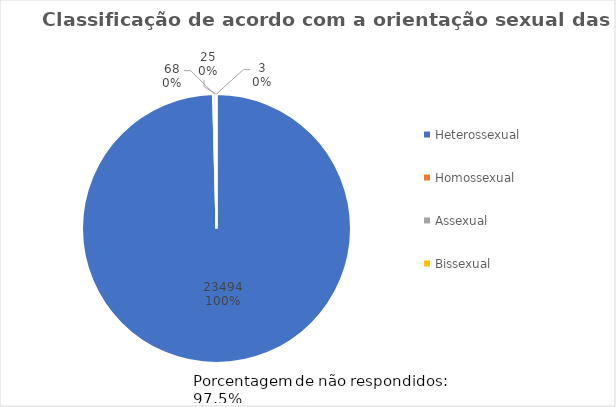
| Category | Series 0 |
|---|---|
| Heterossexual             | 23494 |
| Homossexual               | 68 |
| Assexual                  | 25 |
| Bissexual                 | 3 |